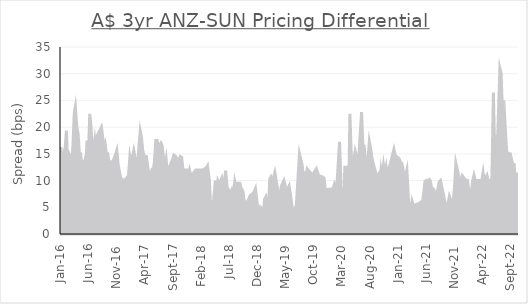
| Category | Diff. |
|---|---|
| 2022-10-13 | 11.5 |
| 2022-10-06 | 10 |
| 2022-09-29 | 10 |
| 2022-09-22 | 13 |
| 2022-09-15 | 13 |
| 2022-09-08 | 14 |
| 2022-09-01 | 15 |
| 2022-08-25 | 15 |
| 2022-08-19 | 14 |
| 2022-08-12 | 16 |
| 2022-08-05 | 20 |
| 2022-07-28 | 25 |
| 2022-07-21 | 22.5 |
| 2022-07-14 | 30 |
| 2022-07-07 | 31 |
| 2022-06-30 | 23.5 |
| 2022-06-23 | 16 |
| 2022-06-16 | 18.5 |
| 2022-06-09 | 14.5 |
| 2022-06-02 | 26.5 |
| 2022-05-26 | 12.5 |
| 2022-05-19 | 2.75 |
| 2022-05-12 | 10 |
| 2022-05-05 | 10 |
| 2022-04-28 | 11 |
| 2022-04-21 | 10.5 |
| 2022-04-13 | 10 |
| 2022-04-07 | 11.5 |
| 2022-03-31 | 10 |
| 2022-03-24 | 10 |
| 2022-03-17 | 10 |
| 2022-03-10 | 10 |
| 2022-03-03 | 10 |
| 2022-02-24 | 10 |
| 2022-02-17 | 11 |
| 2022-02-10 | 10 |
| 2022-02-03 | 8 |
| 2022-01-20 | 8 |
| 2022-01-13 | 10 |
| 2022-01-06 | 10 |
| 2021-12-29 | 10.3 |
| 2021-12-22 | 10.6 |
| 2021-12-16 | 10.9 |
| 2021-12-09 | 9.7 |
| 2021-12-02 | 10 |
| 2021-11-11 | 13.25 |
| 2021-11-04 | 9 |
| 2021-10-28 | 6.143 |
| 2021-10-21 | 5.286 |
| 2021-10-14 | 6.429 |
| 2021-10-07 | 7.071 |
| 2021-09-30 | 5.714 |
| 2021-09-23 | 4.357 |
| 2021-08-20 | 10 |
| 2021-08-13 | 9.75 |
| 2021-08-06 | 8.5 |
| 2021-07-30 | 7.25 |
| 2021-07-23 | 7.5 |
| 2021-07-16 | 8.25 |
| 2021-07-09 | 8.5 |
| 2021-07-02 | 8.75 |
| 2021-06-25 | 10 |
| 2021-06-21 | 10.2 |
| 2021-05-28 | 9.9 |
| 2021-05-21 | 7.6 |
| 2021-05-14 | 5.8 |
| 2021-05-07 | 6 |
| 2021-04-30 | 5.833 |
| 2021-04-23 | 5.667 |
| 2021-04-09 | 5.5 |
| 2021-03-26 | 5.333 |
| 2021-03-19 | 6.167 |
| 2021-03-05 | 3 |
| 2021-02-19 | 12 |
| 2021-02-12 | 11 |
| 2021-02-05 | 10 |
| 2021-01-29 | 12.143 |
| 2021-01-22 | 13.286 |
| 2021-01-15 | 13.429 |
| 2021-01-08 | 14.071 |
| 2020-12-18 | 14.714 |
| 2020-12-11 | 15.857 |
| 2020-11-06 | 11 |
| 2020-10-30 | 12.6 |
| 2020-10-23 | 11.2 |
| 2020-10-16 | 12.8 |
| 2020-10-09 | 10.4 |
| 2020-10-02 | 12 |
| 2020-09-25 | 9.5 |
| 2020-09-18 | 11 |
| 2020-09-11 | 10.5 |
| 2020-08-21 | 13.167 |
| 2020-08-14 | 14.333 |
| 2020-08-07 | 16 |
| 2020-07-31 | 17.3 |
| 2020-07-24 | 14.1 |
| 2020-07-17 | 12.9 |
| 2020-07-10 | 13.7 |
| 2020-07-03 | 16.5 |
| 2020-06-26 | 16.667 |
| 2020-06-19 | 22.833 |
| 2020-06-05 | 15 |
| 2020-05-29 | 13.5 |
| 2020-05-22 | 14.5 |
| 2020-05-15 | 15.5 |
| 2020-05-08 | 14 |
| 2020-05-01 | 12.5 |
| 2020-04-24 | 15 |
| 2020-04-17 | 22.5 |
| 2020-04-09 | 5.25 |
| 2020-04-03 | 3 |
| 2020-03-27 | 12.5 |
| 2020-03-20 | 12.5 |
| 2020-03-16 | 5.5 |
| 2020-03-06 | 8.5 |
| 2020-03-03 | 6.125 |
| 2020-02-21 | 17.25 |
| 2020-02-14 | 13.375 |
| 2020-02-07 | 9.5 |
| 2020-01-31 | 8.667 |
| 2020-01-24 | 9.333 |
| 2020-01-17 | 8.5 |
| 2019-12-06 | 8.25 |
| 2019-11-29 | 10.5 |
| 2019-11-15 | 10.75 |
| 2019-11-08 | 10 |
| 2019-10-25 | 11.6 |
| 2019-10-18 | 12.2 |
| 2019-10-11 | 11.8 |
| 2019-10-04 | 11.4 |
| 2019-09-27 | 11 |
| 2019-09-20 | 11.333 |
| 2019-08-30 | 12.167 |
| 2019-08-23 | 10 |
| 2019-08-16 | 11.333 |
| 2019-08-09 | 11.167 |
| 2019-08-02 | 13 |
| 2019-07-19 | 15 |
| 2019-07-12 | 11 |
| 2019-07-05 | 7 |
| 2019-06-28 | 3 |
| 2019-06-21 | 4.5 |
| 2019-06-14 | 4 |
| 2019-05-31 | 7.5 |
| 2019-05-24 | 9 |
| 2019-05-17 | 8.5 |
| 2019-05-10 | 8 |
| 2019-04-26 | 10 |
| 2019-04-12 | 9 |
| 2019-04-03 | 6 |
| 2019-03-08 | 11.5 |
| 2019-03-01 | 10.562 |
| 2019-02-22 | 10.125 |
| 2019-02-15 | 10.687 |
| 2019-02-08 | 10.25 |
| 2019-02-01 | 3.812 |
| 2019-01-25 | 5.375 |
| 2019-01-18 | 6.937 |
| 2019-01-11 | 6.5 |
| 2019-01-07 | 4.25 |
| 2018-12-21 | 5 |
| 2018-12-13 | 3.75 |
| 2018-12-03 | 5.5 |
| 2018-11-30 | 6.5 |
| 2018-11-23 | 8.5 |
| 2018-11-16 | 7.917 |
| 2018-11-02 | 7.333 |
| 2018-10-26 | 7.25 |
| 2018-10-19 | 6.667 |
| 2018-10-12 | 6.083 |
| 2018-10-05 | 5.5 |
| 2018-09-28 | 6 |
| 2018-09-21 | 6.5 |
| 2018-09-17 | 8 |
| 2018-09-07 | 8.5 |
| 2018-08-31 | 9.5 |
| 2018-08-17 | 9.5 |
| 2018-08-10 | 8.5 |
| 2018-08-03 | 9.8 |
| 2018-07-27 | 8.1 |
| 2018-07-20 | 8.4 |
| 2018-07-12 | 7.7 |
| 2018-07-06 | 8 |
| 2018-06-29 | 6.625 |
| 2018-06-22 | 9.25 |
| 2018-06-15 | 11.875 |
| 2018-06-08 | 9.5 |
| 2018-06-01 | 9 |
| 2018-05-25 | 10.5 |
| 2018-05-18 | 10 |
| 2018-05-11 | 9.5 |
| 2018-05-04 | 10 |
| 2018-04-27 | 7.5 |
| 2018-04-20 | 10 |
| 2018-04-06 | 4.5 |
| 2018-03-29 | 3 |
| 2018-03-19 | 10 |
| 2018-03-09 | 12.75 |
| 2018-03-05 | 12.5 |
| 2018-02-23 | 12.25 |
| 2018-02-12 | 12 |
| 2018-02-02 | 12 |
| 2018-01-19 | 12 |
| 2018-01-12 | 12 |
| 2018-01-05 | 12 |
| 2017-12-15 | 11 |
| 2017-12-08 | 11 |
| 2017-12-01 | 12 |
| 2017-11-24 | 11 |
| 2017-11-17 | 12 |
| 2017-11-10 | 12 |
| 2017-11-03 | 12 |
| 2017-10-27 | 12.167 |
| 2017-10-20 | 14.333 |
| 2017-10-13 | 14.5 |
| 2017-10-06 | 13.75 |
| 2017-09-29 | 14 |
| 2017-09-22 | 14.25 |
| 2017-09-18 | 14.5 |
| 2017-09-08 | 14.75 |
| 2017-09-01 | 14 |
| 2017-08-25 | 13.375 |
| 2017-08-18 | 12.75 |
| 2017-08-11 | 12.125 |
| 2017-08-04 | 11.5 |
| 2017-07-28 | 14 |
| 2017-07-21 | 12.5 |
| 2017-07-14 | 14 |
| 2017-07-07 | 16.5 |
| 2017-06-30 | 17 |
| 2017-06-23 | 16.5 |
| 2017-06-16 | 16.5 |
| 2017-06-09 | 17.5 |
| 2017-06-02 | 17.5 |
| 2017-05-26 | 13.667 |
| 2017-05-19 | 11.833 |
| 2017-05-12 | 12 |
| 2017-05-05 | 11.167 |
| 2017-04-28 | 10.833 |
| 2017-04-24 | 11.5 |
| 2017-04-12 | 14.5 |
| 2017-04-07 | 14.5 |
| 2017-03-31 | 14.5 |
| 2017-03-23 | 15.75 |
| 2017-03-17 | 18 |
| 2017-03-10 | 19.25 |
| 2017-03-03 | 16.5 |
| 2017-02-23 | 12.75 |
| 2017-02-17 | 14 |
| 2017-02-10 | 14.3 |
| 2017-02-03 | 15.6 |
| 2017-01-30 | 14.9 |
| 2017-01-20 | 13.2 |
| 2017-01-13 | 14.5 |
| 2017-01-05 | 10.875 |
| 2016-12-21 | 10.25 |
| 2016-12-15 | 9.625 |
| 2016-12-08 | 10 |
| 2016-12-01 | 9.286 |
| 2016-11-24 | 10.571 |
| 2016-11-11 | 12.857 |
| 2016-11-03 | 15.643 |
| 2016-10-28 | 14.929 |
| 2016-10-20 | 14.214 |
| 2016-10-13 | 13.5 |
| 2016-10-07 | 13.5 |
| 2016-09-29 | 13.5 |
| 2016-09-22 | 13.5 |
| 2016-09-15 | 15 |
| 2016-09-08 | 15 |
| 2016-09-01 | 16.875 |
| 2016-08-26 | 16.25 |
| 2016-08-19 | 18.125 |
| 2016-08-12 | 20 |
| 2016-08-05 | 19.5 |
| 2016-07-29 | 19 |
| 2016-07-22 | 18.5 |
| 2016-07-15 | 15.5 |
| 2016-07-08 | 17.5 |
| 2016-07-01 | 15.167 |
| 2016-06-29 | 13.333 |
| 2016-06-17 | 20 |
| 2016-06-10 | 22.5 |
| 2016-06-03 | 15 |
| 2016-05-26 | 17.5 |
| 2016-05-23 | 15 |
| 2016-05-13 | 13.5 |
| 2016-05-06 | 13.5 |
| 2016-04-29 | 12.5 |
| 2016-04-22 | 15 |
| 2016-04-15 | 15 |
| 2016-04-08 | 18.75 |
| 2016-04-01 | 20 |
| 2016-03-24 | 23.75 |
| 2016-03-18 | 22.5 |
| 2016-03-11 | 16.5 |
| 2016-03-04 | 13.5 |
| 2016-02-26 | 14.5 |
| 2016-02-19 | 15 |
| 2016-02-12 | 12.5 |
| 2016-02-05 | 19.375 |
| 2016-01-29 | 16.25 |
| 2016-01-22 | 15.125 |
| 2016-01-15 | 15 |
| 2016-01-08 | 14.375 |
| 2016-01-05 | 16.25 |